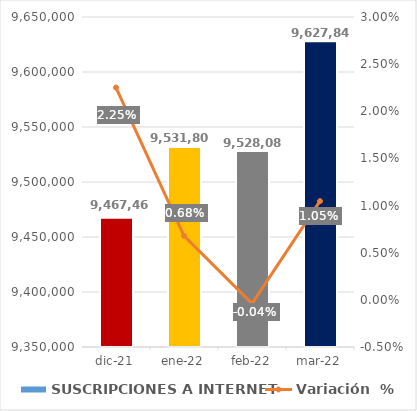
| Category | SUSCRIPCIONES A INTERNET |
|---|---|
| 2021-12-01 | 9467460 |
| 2022-01-01 | 9531800 |
| 2022-02-01 | 9528087 |
| 2022-03-01 | 9627846 |